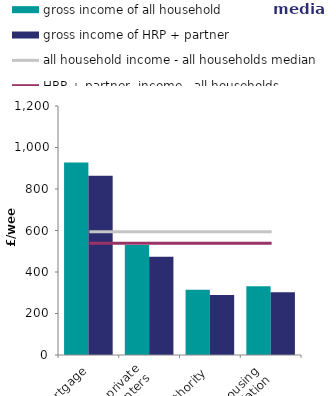
| Category | gross income of all household | gross income of HRP + partner |
|---|---|---|
| buying with mortgage | 928.1 | 863.366 |
| private
renters | 530 | 473.469 |
| local authority | 313.966 | 289.24 |
| housing 
association | 331.442 | 303 |